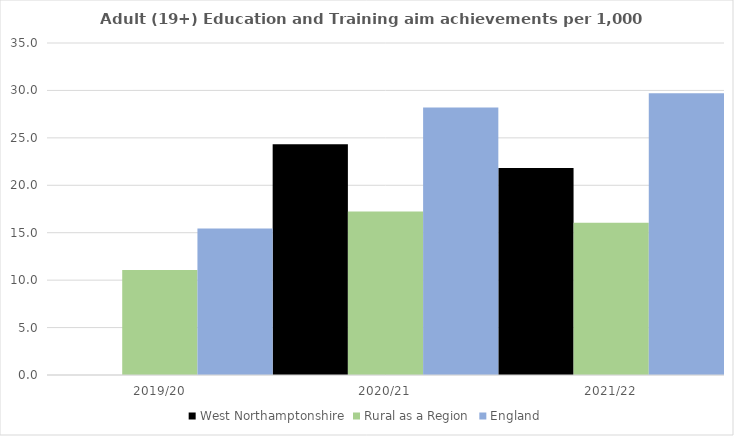
| Category | West Northamptonshire | Rural as a Region | England |
|---|---|---|---|
| 2019/20 | 0 | 11.081 | 15.446 |
| 2020/21 | 24.325 | 17.224 | 28.211 |
| 2021/22 | 21.812 | 16.063 | 29.711 |